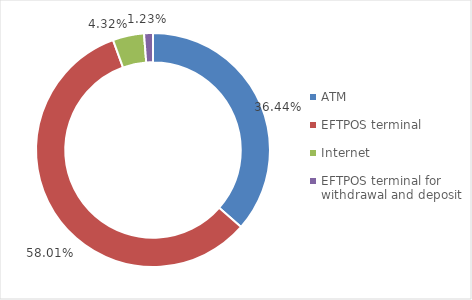
| Category | Series 0 |
|---|---|
| ATM | 5921249806 |
| EFTPOS terminal | 9427823055 |
| Internet | 701964024 |
| EFTPOS terminal for withdrawal and deposit | 199425145 |